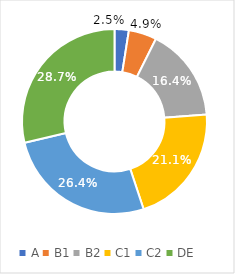
| Category | Series 0 |
|---|---|
| A | 0.025 |
| B1 | 0.049 |
| B2 | 0.164 |
| C1 | 0.211 |
| C2 | 0.264 |
| DE | 0.287 |